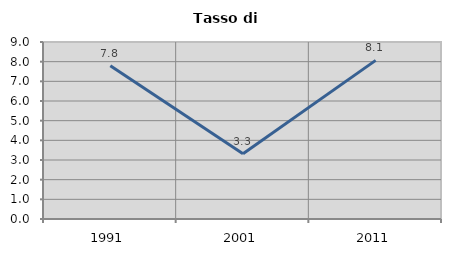
| Category | Tasso di disoccupazione   |
|---|---|
| 1991.0 | 7.791 |
| 2001.0 | 3.32 |
| 2011.0 | 8.065 |